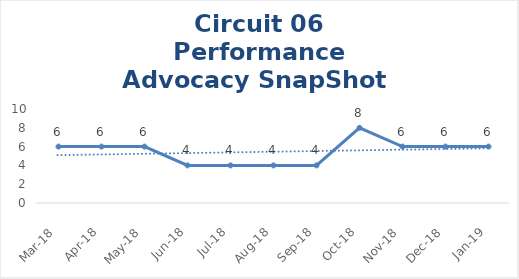
| Category | Circuit 06 |
|---|---|
| Mar-18 | 6 |
| Apr-18 | 6 |
| May-18 | 6 |
| Jun-18 | 4 |
| Jul-18 | 4 |
| Aug-18 | 4 |
| Sep-18 | 4 |
| Oct-18 | 8 |
| Nov-18 | 6 |
| Dec-18 | 6 |
| Jan-19 | 6 |